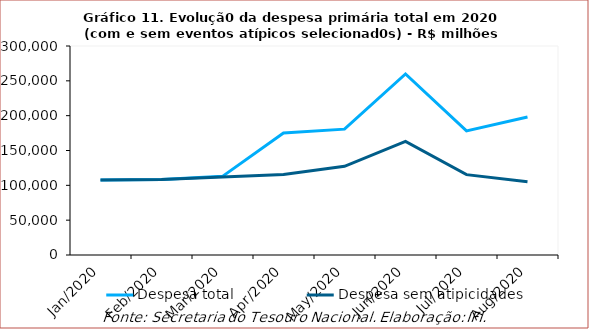
| Category | Despesa total | Despesa sem atipicidades |
|---|---|---|
| 2020-01-01 | 107561.998 | 107561.998 |
| 2020-02-01 | 108252.709 | 108252.578 |
| 2020-03-01 | 112885.32 | 111847.042 |
| 2020-04-01 | 175075.731 | 115670.328 |
| 2020-05-01 | 180629.946 | 127271.991 |
| 2020-06-01 | 259838.092 | 163017.2 |
| 2020-07-01 | 178089.157 | 115328.515 |
| 2020-08-01 | 198199.49 | 105096.332 |